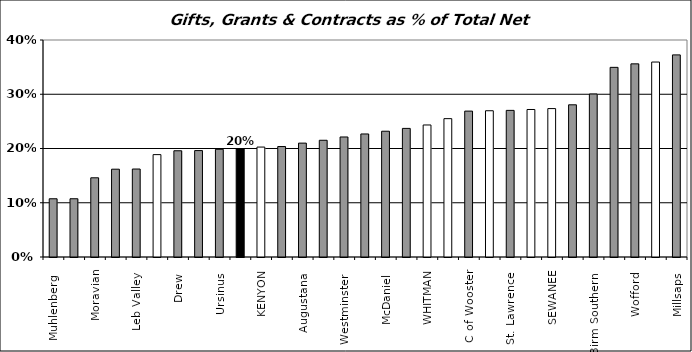
| Category | All Grants |
|---|---|
| Muhlenberg  | 0.107 |
| Lycoming  | 0.107 |
| Moravian | 0.146 |
| Elizabethtown  | 0.162 |
| Leb Valley  | 0.162 |
| GETTYSBURG | 0.189 |
| Drew  | 0.196 |
| Wash & Jeff | 0.196 |
| Ursinus  | 0.199 |
| Juniata  | 0.199 |
| KENYON | 0.203 |
| Susquehanna  | 0.204 |
| Augustana  | 0.21 |
| Wittenberg  | 0.215 |
| Westminster  | 0.221 |
| Allegheny  | 0.227 |
| McDaniel  | 0.232 |
| Knox  | 0.237 |
| WHITMAN | 0.243 |
| UNION | 0.255 |
| C of Wooster | 0.269 |
| F & M * | 0.27 |
| St. Lawrence  | 0.27 |
| CENTRE | 0.272 |
| SEWANEE | 0.274 |
| Washington  | 0.281 |
| Birm Southern  | 0.3 |
| Presbyterian  | 0.35 |
| Wofford  | 0.356 |
| DICKINSON | 0.359 |
| Millsaps  | 0.373 |